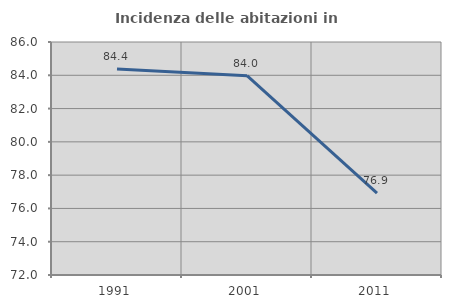
| Category | Incidenza delle abitazioni in proprietà  |
|---|---|
| 1991.0 | 84.381 |
| 2001.0 | 83.974 |
| 2011.0 | 76.923 |